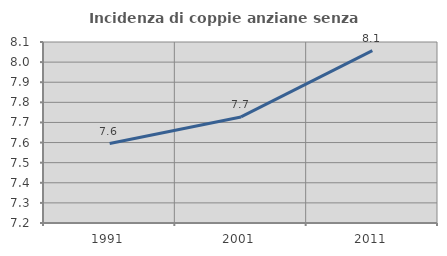
| Category | Incidenza di coppie anziane senza figli  |
|---|---|
| 1991.0 | 7.595 |
| 2001.0 | 7.727 |
| 2011.0 | 8.057 |